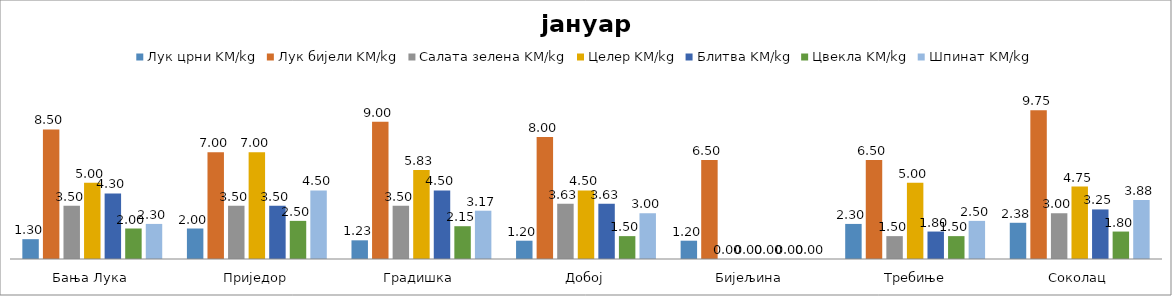
| Category | Лук црни KM/kg | Лук бијели KM/kg | Салата зелена KM/kg | Целер KM/kg | Блитва KM/kg | Цвекла KM/kg | Шпинат KM/kg |
|---|---|---|---|---|---|---|---|
| Бања Лука | 1.3 | 8.5 | 3.5 | 5 | 4.3 | 2 | 2.3 |
| Приједор | 2 | 7 | 3.5 | 7 | 3.5 | 2.5 | 4.5 |
| Градишка | 1.225 | 9 | 3.5 | 5.833 | 4.5 | 2.15 | 3.167 |
| Добој | 1.2 | 8 | 3.625 | 4.5 | 3.625 | 1.5 | 3 |
| Бијељина | 1.2 | 6.5 | 0 | 0 | 0 | 0 | 0 |
|  Требиње | 2.3 | 6.5 | 1.5 | 5 | 1.8 | 1.5 | 2.5 |
| Соколац | 2.375 | 9.75 | 3 | 4.75 | 3.25 | 1.8 | 3.875 |